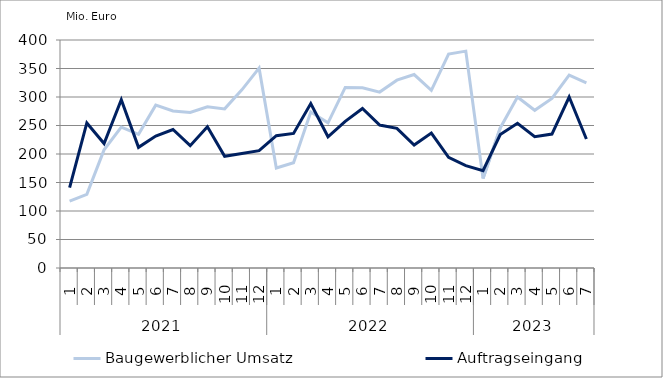
| Category | Baugewerblicher Umsatz | Auftragseingang |
|---|---|---|
| 0 | 117421.805 | 141020.655 |
| 1 | 129162.55 | 254416.876 |
| 2 | 207280.837 | 218451.405 |
| 3 | 247094.279 | 295077.868 |
| 4 | 234515.312 | 211696.129 |
| 5 | 285732.845 | 231455.155 |
| 6 | 275480.885 | 242932.505 |
| 7 | 272787.524 | 214636.944 |
| 8 | 282850.254 | 247827.991 |
| 9 | 279173.21 | 196069.238 |
| 10 | 312511.437 | 201015.897 |
| 11 | 350582.01 | 205949.991 |
| 12 | 175456.852 | 232178.255 |
| 13 | 184578.32 | 236006.862 |
| 14 | 273732.567 | 288451.109 |
| 15 | 254683.671 | 230228.968 |
| 16 | 316794.568 | 257235.39 |
| 17 | 316277.567 | 279900.179 |
| 18 | 308621.034 | 250827.343 |
| 19 | 329490.411 | 244949.341 |
| 20 | 339435.208 | 215809.075 |
| 21 | 311599.811 | 236674.056 |
| 22 | 375203.994 | 194107.214 |
| 23 | 380445.583 | 179631.624 |
| 24 | 156885.157 | 170764.939 |
| 25 | 245647.016 | 234064.391 |
| 26 | 299793.904 | 253873.168 |
| 27 | 276653.498 | 230304.701 |
| 28 | 297513.239 | 235047.978 |
| 29 | 338296.53 | 299989.264 |
| 30 | 324660.651 | 226217.704 |